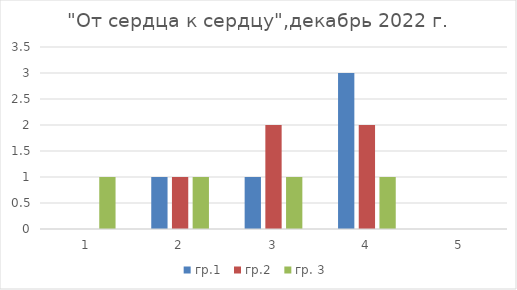
| Category | гр.1  | гр.2  | гр. 3  |
|---|---|---|---|
| 0 | 0 | 0 | 1 |
| 1 | 1 | 1 | 1 |
| 2 | 1 | 2 | 1 |
| 3 | 3 | 2 | 1 |
| 4 | 0 | 0 | 0 |